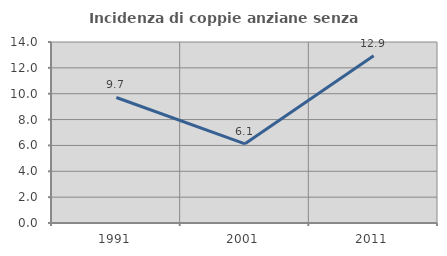
| Category | Incidenza di coppie anziane senza figli  |
|---|---|
| 1991.0 | 9.709 |
| 2001.0 | 6.122 |
| 2011.0 | 12.941 |